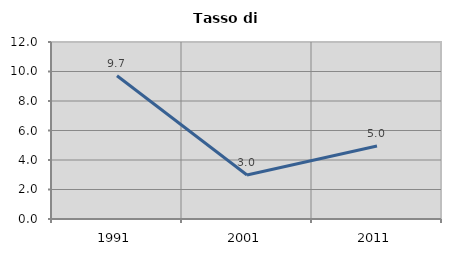
| Category | Tasso di disoccupazione   |
|---|---|
| 1991.0 | 9.709 |
| 2001.0 | 2.985 |
| 2011.0 | 4.95 |